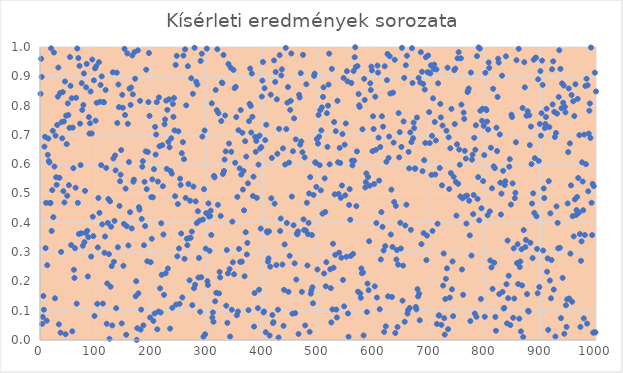
| Category | Series 0 |
|---|---|
| 1.0 | 0.84 |
| 2.0 | 0.96 |
| 3.0 | 0.898 |
| 4.0 | 0.055 |
| 5.0 | 0.079 |
| 6.0 | 0.15 |
| 7.0 | 0.103 |
| 8.0 | 0.66 |
| 9.0 | 0.693 |
| 10.0 | 0.314 |
| 11.0 | 0.468 |
| 12.0 | 0.066 |
| 13.0 | 0.255 |
| 14.0 | 0.632 |
| 15.0 | 0.688 |
| 16.0 | 0.611 |
| 17.0 | 0.606 |
| 18.0 | 0.468 |
| 19.0 | 0.468 |
| 20.0 | 0.995 |
| 21.0 | 0.372 |
| 22.0 | 0.511 |
| 23.0 | 0.714 |
| 24.0 | 0.419 |
| 25.0 | 0.981 |
| 26.0 | 0.592 |
| 27.0 | 0.142 |
| 28.0 | 0.697 |
| 29.0 | 0.555 |
| 30.0 | 0.53 |
| 31.0 | 0.734 |
| 32.0 | 0.83 |
| 33.0 | 0.93 |
| 34.0 | 0.054 |
| 35.0 | 0.554 |
| 36.0 | 0.842 |
| 37.0 | 0.025 |
| 38.0 | 0.301 |
| 39.0 | 0.744 |
| 40.0 | 0.688 |
| 41.0 | 0.846 |
| 42.0 | 0.508 |
| 43.0 | 0.746 |
| 44.0 | 0.469 |
| 45.0 | 0.882 |
| 46.0 | 0.02 |
| 47.0 | 0.766 |
| 48.0 | 0.669 |
| 49.0 | 0.492 |
| 50.0 | 0.807 |
| 51.0 | 0.768 |
| 52.0 | 0.528 |
| 53.0 | 0.724 |
| 54.0 | 0.966 |
| 55.0 | 0.867 |
| 56.0 | 0.324 |
| 57.0 | 0.825 |
| 58.0 | 0.03 |
| 59.0 | 0.725 |
| 60.0 | 0.586 |
| 61.0 | 0.24 |
| 62.0 | 0.212 |
| 63.0 | 0.313 |
| 64.0 | 0.52 |
| 65.0 | 0.827 |
| 66.0 | 0.124 |
| 67.0 | 0.995 |
| 68.0 | 0.468 |
| 69.0 | 0.962 |
| 70.0 | 0.362 |
| 71.0 | 0.936 |
| 72.0 | 0.738 |
| 73.0 | 0.597 |
| 74.0 | 0.364 |
| 75.0 | 0.877 |
| 76.0 | 0.785 |
| 77.0 | 0.322 |
| 78.0 | 0.802 |
| 79.0 | 0.91 |
| 80.0 | 0.334 |
| 81.0 | 0.509 |
| 82.0 | 0.366 |
| 83.0 | 0.862 |
| 84.0 | 0.942 |
| 85.0 | 0.373 |
| 86.0 | 0.217 |
| 87.0 | 0.351 |
| 88.0 | 0.761 |
| 89.0 | 0.705 |
| 90.0 | 0.74 |
| 91.0 | 0.848 |
| 92.0 | 0.285 |
| 93.0 | 0.705 |
| 94.0 | 0.957 |
| 95.0 | 0.421 |
| 96.0 | 0.354 |
| 97.0 | 0.886 |
| 98.0 | 0.082 |
| 99.0 | 0.927 |
| 100.0 | 0.749 |
| 101.0 | 0.934 |
| 102.0 | 0.81 |
| 103.0 | 0.123 |
| 104.0 | 0.316 |
| 105.0 | 0.485 |
| 106.0 | 0.948 |
| 107.0 | 0.434 |
| 108.0 | 0.813 |
| 109.0 | 0.87 |
| 110.0 | 0.597 |
| 111.0 | 0.9 |
| 112.0 | 0.395 |
| 113.0 | 0.124 |
| 114.0 | 0.812 |
| 115.0 | 0.811 |
| 116.0 | 0.298 |
| 117.0 | 0.353 |
| 118.0 | 0.853 |
| 119.0 | 0.587 |
| 120.0 | 0.055 |
| 121.0 | 0.193 |
| 122.0 | 0.4 |
| 123.0 | 0.481 |
| 124.0 | 0.293 |
| 125.0 | 0.004 |
| 126.0 | 0.473 |
| 127.0 | 0.182 |
| 128.0 | 0.387 |
| 129.0 | 0.252 |
| 130.0 | 0.05 |
| 131.0 | 0.914 |
| 132.0 | 0.62 |
| 133.0 | 0.267 |
| 134.0 | 0.407 |
| 135.0 | 0.63 |
| 136.0 | 0.579 |
| 137.0 | 0.109 |
| 138.0 | 0.912 |
| 139.0 | 0.741 |
| 140.0 | 0.317 |
| 141.0 | 0.872 |
| 142.0 | 0.795 |
| 143.0 | 0.458 |
| 144.0 | 0.542 |
| 145.0 | 0.564 |
| 146.0 | 0.648 |
| 147.0 | 0.057 |
| 148.0 | 0.837 |
| 149.0 | 0.793 |
| 150.0 | 0.253 |
| 151.0 | 0.396 |
| 152.0 | 0.994 |
| 153.0 | 0.768 |
| 154.0 | 0.517 |
| 155.0 | 0.018 |
| 156.0 | 0.388 |
| 157.0 | 0.978 |
| 158.0 | 0.738 |
| 159.0 | 0.323 |
| 160.0 | 0.607 |
| 161.0 | 0.858 |
| 162.0 | 0.436 |
| 163.0 | 0.802 |
| 164.0 | 0.862 |
| 165.0 | 0.381 |
| 166.0 | 0.971 |
| 167.0 | 0.839 |
| 168.0 | 0.54 |
| 169.0 | 0.547 |
| 170.0 | 0.983 |
| 171.0 | 0.892 |
| 172.0 | 0.149 |
| 173.0 | 0.201 |
| 174.0 | 0 |
| 175.0 | 0.04 |
| 176.0 | 0.989 |
| 177.0 | 0.159 |
| 178.0 | 0.453 |
| 179.0 | 0.445 |
| 180.0 | 0.816 |
| 181.0 | 0.035 |
| 182.0 | 0.104 |
| 183.0 | 0.413 |
| 184.0 | 0.591 |
| 185.0 | 0.61 |
| 186.0 | 0.05 |
| 187.0 | 0.323 |
| 188.0 | 0.54 |
| 189.0 | 0.389 |
| 190.0 | 0.644 |
| 191.0 | 0.923 |
| 192.0 | 0.515 |
| 193.0 | 0.269 |
| 194.0 | 0.642 |
| 195.0 | 0.812 |
| 196.0 | 0.979 |
| 197.0 | 0.765 |
| 198.0 | 0.077 |
| 199.0 | 0.265 |
| 200.0 | 0.488 |
| 201.0 | 0.346 |
| 202.0 | 0.548 |
| 203.0 | 0.487 |
| 204.0 | 0.065 |
| 205.0 | 0.583 |
| 206.0 | 0.09 |
| 207.0 | 0.727 |
| 208.0 | 0.633 |
| 209.0 | 0.701 |
| 210.0 | 0.812 |
| 211.0 | 0.036 |
| 212.0 | 0.541 |
| 213.0 | 0.097 |
| 214.0 | 0.828 |
| 215.0 | 0.661 |
| 216.0 | 0.176 |
| 217.0 | 0.094 |
| 218.0 | 0.398 |
| 219.0 | 0.222 |
| 220.0 | 0.665 |
| 221.0 | 0.525 |
| 222.0 | 0.36 |
| 223.0 | 0.154 |
| 224.0 | 0.736 |
| 225.0 | 0.753 |
| 226.0 | 0.227 |
| 227.0 | 0.817 |
| 228.0 | 0.584 |
| 229.0 | 0.785 |
| 230.0 | 0.244 |
| 231.0 | 0.676 |
| 232.0 | 0.821 |
| 233.0 | 0.658 |
| 234.0 | 0.039 |
| 235.0 | 0.577 |
| 236.0 | 0.689 |
| 237.0 | 0.568 |
| 238.0 | 0.11 |
| 239.0 | 0.806 |
| 240.0 | 0.761 |
| 241.0 | 0.826 |
| 242.0 | 0.715 |
| 243.0 | 0.491 |
| 244.0 | 0.939 |
| 245.0 | 0.121 |
| 246.0 | 0.97 |
| 247.0 | 0.286 |
| 248.0 | 0.464 |
| 249.0 | 0.712 |
| 250.0 | 0.312 |
| 251.0 | 0.123 |
| 252.0 | 0.551 |
| 253.0 | 0.529 |
| 254.0 | 0.363 |
| 255.0 | 0.638 |
| 256.0 | 0.145 |
| 257.0 | 0.675 |
| 258.0 | 0.971 |
| 259.0 | 0.617 |
| 260.0 | 0.277 |
| 261.0 | 0.992 |
| 262.0 | 0.485 |
| 263.0 | 0.801 |
| 264.0 | 0.346 |
| 265.0 | 0.324 |
| 266.0 | 0.935 |
| 267.0 | 0.533 |
| 268.0 | 0.347 |
| 269.0 | 0.204 |
| 270.0 | 0.475 |
| 271.0 | 0.349 |
| 272.0 | 0.893 |
| 273.0 | 0.37 |
| 274.0 | 0.119 |
| 275.0 | 0.84 |
| 276.0 | 0.524 |
| 277.0 | 0.177 |
| 278.0 | 0.997 |
| 279.0 | 0.189 |
| 280.0 | 0.473 |
| 281.0 | 0.881 |
| 282.0 | 0.399 |
| 283.0 | 0.872 |
| 284.0 | 0.439 |
| 285.0 | 0.213 |
| 286.0 | 0.28 |
| 287.0 | 0.407 |
| 288.0 | 0.096 |
| 289.0 | 0.952 |
| 290.0 | 0.214 |
| 291.0 | 0.977 |
| 292.0 | 0.694 |
| 293.0 | 0.411 |
| 294.0 | 0.011 |
| 295.0 | 0.515 |
| 296.0 | 0.715 |
| 297.0 | 0.02 |
| 298.0 | 0.312 |
| 299.0 | 0.433 |
| 300.0 | 0.994 |
| 301.0 | 0.201 |
| 302.0 | 0.188 |
| 303.0 | 0.466 |
| 304.0 | 0.422 |
| 305.0 | 0.304 |
| 306.0 | 0.423 |
| 307.0 | 0.442 |
| 308.0 | 0.358 |
| 309.0 | 0.808 |
| 310.0 | 0.077 |
| 311.0 | 0.094 |
| 312.0 | 0.062 |
| 313.0 | 0.56 |
| 314.0 | 0.555 |
| 315.0 | 0.132 |
| 316.0 | 0.853 |
| 317.0 | 0.161 |
| 318.0 | 0.784 |
| 319.0 | 0.992 |
| 320.0 | 0.461 |
| 321.0 | 0.774 |
| 322.0 | 0.159 |
| 323.0 | 0.232 |
| 324.0 | 0.214 |
| 325.0 | 0.423 |
| 326.0 | 0.747 |
| 327.0 | 0.879 |
| 328.0 | 0.877 |
| 329.0 | 0.567 |
| 330.0 | 0.973 |
| 331.0 | 0.577 |
| 332.0 | 0.616 |
| 333.0 | 0.766 |
| 334.0 | 0.644 |
| 335.0 | 0.117 |
| 336.0 | 0.307 |
| 337.0 | 0.059 |
| 338.0 | 0.227 |
| 339.0 | 0.942 |
| 340.0 | 0.671 |
| 341.0 | 0.242 |
| 342.0 | 0.012 |
| 343.0 | 0.929 |
| 344.0 | 0.642 |
| 345.0 | 0.103 |
| 346.0 | 0.404 |
| 347.0 | 0.265 |
| 348.0 | 0.922 |
| 349.0 | 0.224 |
| 350.0 | 0.86 |
| 351.0 | 0.605 |
| 352.0 | 0.864 |
| 353.0 | 0.761 |
| 354.0 | 0.084 |
| 355.0 | 0.488 |
| 356.0 | 0.097 |
| 357.0 | 0.716 |
| 358.0 | 0.311 |
| 359.0 | 0.586 |
| 360.0 | 0.267 |
| 361.0 | 0.785 |
| 362.0 | 0.564 |
| 363.0 | 0.267 |
| 364.0 | 0.707 |
| 365.0 | 0.513 |
| 366.0 | 0.577 |
| 367.0 | 0.443 |
| 368.0 | 0.218 |
| 369.0 | 0.678 |
| 370.0 | 0.368 |
| 371.0 | 0.626 |
| 372.0 | 0.292 |
| 373.0 | 0.331 |
| 374.0 | 0.535 |
| 375.0 | 0.102 |
| 376.0 | 0.747 |
| 377.0 | 0.806 |
| 378.0 | 0.926 |
| 379.0 | 0.799 |
| 380.0 | 0.708 |
| 381.0 | 0.91 |
| 382.0 | 0.762 |
| 383.0 | 0.492 |
| 384.0 | 0.557 |
| 385.0 | 0.046 |
| 386.0 | 0.16 |
| 387.0 | 0.693 |
| 388.0 | 0.642 |
| 389.0 | 0.679 |
| 390.0 | 0.485 |
| 391.0 | 0.692 |
| 392.0 | 0.109 |
| 393.0 | 0.599 |
| 394.0 | 0.172 |
| 395.0 | 0.698 |
| 396.0 | 0.654 |
| 397.0 | 0.38 |
| 398.0 | 0.658 |
| 399.0 | 0.831 |
| 400.0 | 0.885 |
| 401.0 | 0.949 |
| 402.0 | 0.094 |
| 403.0 | 0.097 |
| 404.0 | 0.859 |
| 405.0 | 0.682 |
| 406.0 | 0.027 |
| 407.0 | 0.735 |
| 408.0 | 0.371 |
| 409.0 | 0.367 |
| 410.0 | 0.268 |
| 411.0 | 0.278 |
| 412.0 | 0.371 |
| 413.0 | 0.015 |
| 414.0 | 0.25 |
| 415.0 | 0.837 |
| 416.0 | 0.484 |
| 417.0 | 0.621 |
| 418.0 | 0.085 |
| 419.0 | 0.058 |
| 420.0 | 0.061 |
| 421.0 | 0.954 |
| 422.0 | 0.465 |
| 423.0 | 0.881 |
| 424.0 | 0.915 |
| 425.0 | 0.256 |
| 426.0 | 0.821 |
| 427.0 | 0.636 |
| 428.0 | 0.103 |
| 429.0 | 0.009 |
| 430.0 | 0.721 |
| 431.0 | 0.972 |
| 432.0 | 0.372 |
| 433.0 | 0.415 |
| 434.0 | 0.903 |
| 435.0 | 0.924 |
| 436.0 | 0.258 |
| 437.0 | 0.654 |
| 438.0 | 0.048 |
| 439.0 | 0.171 |
| 440.0 | 0.326 |
| 441.0 | 0.599 |
| 442.0 | 0.997 |
| 443.0 | 0.72 |
| 444.0 | 0.399 |
| 445.0 | 0.81 |
| 446.0 | 0.863 |
| 447.0 | 0.164 |
| 448.0 | 0.605 |
| 449.0 | 0.287 |
| 450.0 | 0.785 |
| 451.0 | 0.816 |
| 452.0 | 0.978 |
| 453.0 | 0.49 |
| 454.0 | 0.09 |
| 455.0 | 0.644 |
| 456.0 | 0.392 |
| 457.0 | 0.756 |
| 458.0 | 0.262 |
| 459.0 | 0.092 |
| 460.0 | 0.685 |
| 461.0 | 0.206 |
| 462.0 | 0.363 |
| 463.0 | 0.361 |
| 464.0 | 0.371 |
| 465.0 | 0.021 |
| 466.0 | 0.837 |
| 467.0 | 0.828 |
| 468.0 | 0.667 |
| 469.0 | 0.911 |
| 470.0 | 0.678 |
| 471.0 | 0.164 |
| 472.0 | 0.641 |
| 473.0 | 0.973 |
| 474.0 | 0.412 |
| 475.0 | 0.375 |
| 476.0 | 0.623 |
| 477.0 | 0.05 |
| 478.0 | 0.373 |
| 479.0 | 0.873 |
| 480.0 | 0.468 |
| 481.0 | 0.254 |
| 482.0 | 0.361 |
| 483.0 | 0.4 |
| 484.0 | 0.5 |
| 485.0 | 0.028 |
| 486.0 | 0.556 |
| 487.0 | 0.158 |
| 488.0 | 0.169 |
| 489.0 | 0.358 |
| 490.0 | 0.18 |
| 491.0 | 0.125 |
| 492.0 | 0.495 |
| 493.0 | 0.901 |
| 494.0 | 0.909 |
| 495.0 | 0.607 |
| 496.0 | 0.605 |
| 497.0 | 0.523 |
| 498.0 | 0.686 |
| 499.0 | 0.241 |
| 500.0 | 0.67 |
| 501.0 | 0.768 |
| 502.0 | 0.694 |
| 503.0 | 0.597 |
| 504.0 | 0.785 |
| 505.0 | 0.511 |
| 506.0 | 0.715 |
| 507.0 | 0.794 |
| 508.0 | 0.431 |
| 509.0 | 0.83 |
| 510.0 | 0.862 |
| 511.0 | 0.227 |
| 512.0 | 0.552 |
| 513.0 | 0.437 |
| 514.0 | 0.183 |
| 515.0 | 0.265 |
| 516.0 | 0.774 |
| 517.0 | 0.659 |
| 518.0 | 0.8 |
| 519.0 | 0.872 |
| 520.0 | 0.977 |
| 521.0 | 0.6 |
| 522.0 | 0.241 |
| 523.0 | 0.177 |
| 524.0 | 0.06 |
| 525.0 | 0.925 |
| 526.0 | 0.104 |
| 527.0 | 0.328 |
| 528.0 | 0.247 |
| 529.0 | 0.744 |
| 530.0 | 0.497 |
| 531.0 | 0.291 |
| 532.0 | 0.713 |
| 533.0 | 0.104 |
| 534.0 | 0.077 |
| 535.0 | 0.816 |
| 536.0 | 0.607 |
| 537.0 | 0.498 |
| 538.0 | 0.298 |
| 539.0 | 0.656 |
| 540.0 | 0.604 |
| 541.0 | 0.485 |
| 542.0 | 0.281 |
| 543.0 | 0.527 |
| 544.0 | 0.703 |
| 545.0 | 0.205 |
| 546.0 | 0.895 |
| 547.0 | 0.115 |
| 548.0 | 0.666 |
| 549.0 | 0.494 |
| 550.0 | 0.739 |
| 551.0 | 0.284 |
| 552.0 | 0.917 |
| 553.0 | 0.883 |
| 554.0 | 0.091 |
| 555.0 | 0.011 |
| 556.0 | 0.461 |
| 557.0 | 0.515 |
| 558.0 | 0.41 |
| 559.0 | 0.287 |
| 560.0 | 0.877 |
| 561.0 | 0.612 |
| 562.0 | 0.596 |
| 563.0 | 0.294 |
| 564.0 | 0.918 |
| 565.0 | 0.612 |
| 566.0 | 0.965 |
| 567.0 | 0.999 |
| 568.0 | 0.932 |
| 569.0 | 0.457 |
| 570.0 | 0.644 |
| 571.0 | 0.935 |
| 572.0 | 0.165 |
| 573.0 | 0.84 |
| 574.0 | 0.801 |
| 575.0 | 0.796 |
| 576.0 | 0.159 |
| 577.0 | 0.144 |
| 578.0 | 0.244 |
| 579.0 | 0.228 |
| 580.0 | 0.719 |
| 581.0 | 0.23 |
| 582.0 | 0.016 |
| 583.0 | 0.891 |
| 584.0 | 0.819 |
| 585.0 | 0.521 |
| 586.0 | 0.539 |
| 587.0 | 0.568 |
| 588.0 | 0.095 |
| 589.0 | 0.193 |
| 590.0 | 0.556 |
| 591.0 | 0.17 |
| 592.0 | 0.337 |
| 593.0 | 0.527 |
| 594.0 | 0.876 |
| 595.0 | 0.853 |
| 596.0 | 0.933 |
| 597.0 | 0.92 |
| 598.0 | 0.644 |
| 599.0 | 0.764 |
| 600.0 | 0.72 |
| 601.0 | 0.532 |
| 602.0 | 0.183 |
| 603.0 | 0.83 |
| 604.0 | 0.649 |
| 605.0 | 0.399 |
| 606.0 | 0.145 |
| 607.0 | 0.937 |
| 608.0 | 0.913 |
| 609.0 | 0.691 |
| 610.0 | 0.544 |
| 611.0 | 0.105 |
| 612.0 | 0.659 |
| 613.0 | 0.275 |
| 614.0 | 0.436 |
| 615.0 | 0.764 |
| 616.0 | 0.386 |
| 617.0 | 0.728 |
| 618.0 | 0.305 |
| 619.0 | 0.028 |
| 620.0 | 0.934 |
| 621.0 | 0.321 |
| 622.0 | 0.047 |
| 623.0 | 0.608 |
| 624.0 | 0.887 |
| 625.0 | 0.976 |
| 626.0 | 0.149 |
| 627.0 | 0.621 |
| 628.0 | 0.694 |
| 629.0 | 0.968 |
| 630.0 | 0.841 |
| 631.0 | 0.36 |
| 632.0 | 0.513 |
| 633.0 | 0.147 |
| 634.0 | 0.317 |
| 635.0 | 0.844 |
| 636.0 | 0.674 |
| 637.0 | 0.471 |
| 638.0 | 0.956 |
| 639.0 | 0.024 |
| 640.0 | 0.458 |
| 641.0 | 0.275 |
| 642.0 | 0.307 |
| 643.0 | 0.044 |
| 644.0 | 0.257 |
| 645.0 | 0.774 |
| 646.0 | 0.623 |
| 647.0 | 0.709 |
| 648.0 | 0.4 |
| 649.0 | 0.312 |
| 650.0 | 0.659 |
| 651.0 | 0.997 |
| 652.0 | 0.134 |
| 653.0 | 0.254 |
| 654.0 | 0.746 |
| 655.0 | 0.895 |
| 656.0 | 0.062 |
| 657.0 | 0.391 |
| 658.0 | 0.938 |
| 659.0 | 0.462 |
| 660.0 | 0.97 |
| 661.0 | 0.09 |
| 662.0 | 0.102 |
| 663.0 | 0.642 |
| 664.0 | 0.586 |
| 665.0 | 0.109 |
| 666.0 | 0.708 |
| 667.0 | 0.376 |
| 668.0 | 0.675 |
| 669.0 | 0.996 |
| 670.0 | 0.877 |
| 671.0 | 0.689 |
| 672.0 | 0.742 |
| 673.0 | 0.723 |
| 674.0 | 0.585 |
| 675.0 | 0.585 |
| 676.0 | 0.113 |
| 677.0 | 0.105 |
| 678.0 | 0.759 |
| 679.0 | 0.173 |
| 680.0 | 0.149 |
| 681.0 | 0.895 |
| 682.0 | 0.158 |
| 683.0 | 0.067 |
| 684.0 | 0.879 |
| 685.0 | 0.982 |
| 686.0 | 0.327 |
| 687.0 | 0.915 |
| 688.0 | 0.576 |
| 689.0 | 0.874 |
| 690.0 | 0.365 |
| 691.0 | 0.614 |
| 692.0 | 0.855 |
| 693.0 | 0.672 |
| 694.0 | 0.965 |
| 695.0 | 0.273 |
| 696.0 | 0.356 |
| 697.0 | 0.914 |
| 698.0 | 0.971 |
| 699.0 | 0.913 |
| 700.0 | 0.778 |
| 701.0 | 0.672 |
| 702.0 | 0.91 |
| 703.0 | 0.937 |
| 704.0 | 0.564 |
| 705.0 | 0.697 |
| 706.0 | 0.372 |
| 707.0 | 0.825 |
| 708.0 | 0.925 |
| 709.0 | 0.94 |
| 710.0 | 0.744 |
| 711.0 | 0.565 |
| 712.0 | 0.681 |
| 713.0 | 0.924 |
| 714.0 | 0.055 |
| 715.0 | 0.397 |
| 716.0 | 0.876 |
| 717.0 | 0.084 |
| 718.0 | 0.084 |
| 719.0 | 0.587 |
| 720.0 | 0.806 |
| 721.0 | 0.76 |
| 722.0 | 0.052 |
| 723.0 | 0.528 |
| 724.0 | 0.732 |
| 725.0 | 0.186 |
| 726.0 | 0.295 |
| 727.0 | 0.075 |
| 728.0 | 0.019 |
| 729.0 | 0.14 |
| 730.0 | 0.209 |
| 731.0 | 0.714 |
| 732.0 | 0.245 |
| 733.0 | 0.929 |
| 734.0 | 0.037 |
| 735.0 | 0.692 |
| 736.0 | 0.515 |
| 737.0 | 0.145 |
| 738.0 | 0.655 |
| 739.0 | 0.57 |
| 740.0 | 0.789 |
| 741.0 | 0.173 |
| 742.0 | 0.268 |
| 743.0 | 0.081 |
| 744.0 | 0.557 |
| 745.0 | 0.921 |
| 746.0 | 0.737 |
| 747.0 | 0.926 |
| 748.0 | 0.539 |
| 749.0 | 0.424 |
| 750.0 | 0.668 |
| 751.0 | 0.961 |
| 752.0 | 0.533 |
| 753.0 | 0.982 |
| 754.0 | 0.65 |
| 755.0 | 0.598 |
| 756.0 | 0.49 |
| 757.0 | 0.961 |
| 758.0 | 0.803 |
| 759.0 | 0.241 |
| 760.0 | 0.484 |
| 761.0 | 0.154 |
| 762.0 | 0.776 |
| 763.0 | 0.755 |
| 764.0 | 0.646 |
| 765.0 | 0.49 |
| 766.0 | 0.619 |
| 767.0 | 0.397 |
| 768.0 | 0.493 |
| 769.0 | 0.846 |
| 770.0 | 0.851 |
| 771.0 | 0.858 |
| 772.0 | 0.475 |
| 773.0 | 0.357 |
| 774.0 | 0.065 |
| 775.0 | 0.913 |
| 776.0 | 0.288 |
| 777.0 | 0.615 |
| 778.0 | 0.632 |
| 779.0 | 0.43 |
| 780.0 | 0.495 |
| 781.0 | 0.69 |
| 782.0 | 0.09 |
| 783.0 | 0.65 |
| 784.0 | 0.733 |
| 785.0 | 0.079 |
| 786.0 | 0.969 |
| 787.0 | 0.482 |
| 788.0 | 0.556 |
| 789.0 | 0.998 |
| 790.0 | 0.408 |
| 791.0 | 0.994 |
| 792.0 | 0.783 |
| 793.0 | 0.14 |
| 794.0 | 0.45 |
| 795.0 | 0.748 |
| 796.0 | 0.789 |
| 797.0 | 0.542 |
| 798.0 | 0.731 |
| 799.0 | 0.631 |
| 800.0 | 0.079 |
| 801.0 | 0.912 |
| 802.0 | 0.788 |
| 803.0 | 0.784 |
| 804.0 | 0.745 |
| 805.0 | 0.426 |
| 806.0 | 0.718 |
| 807.0 | 0.947 |
| 808.0 | 0.929 |
| 809.0 | 0.439 |
| 810.0 | 0.271 |
| 811.0 | 0.656 |
| 812.0 | 0.248 |
| 813.0 | 0.518 |
| 814.0 | 0.175 |
| 815.0 | 0.857 |
| 816.0 | 0.593 |
| 817.0 | 0.264 |
| 818.0 | 0.587 |
| 819.0 | 0.079 |
| 820.0 | 0.032 |
| 821.0 | 0.725 |
| 822.0 | 0.645 |
| 823.0 | 0.83 |
| 824.0 | 0.96 |
| 825.0 | 0.947 |
| 826.0 | 0.157 |
| 827.0 | 0.702 |
| 828.0 | 0.537 |
| 829.0 | 0.428 |
| 830.0 | 0.499 |
| 831.0 | 0.902 |
| 832.0 | 0.164 |
| 833.0 | 0.577 |
| 834.0 | 0.107 |
| 835.0 | 0.11 |
| 836.0 | 0.529 |
| 837.0 | 0.542 |
| 838.0 | 0.968 |
| 839.0 | 0.19 |
| 840.0 | 0.057 |
| 841.0 | 0.339 |
| 842.0 | 0.143 |
| 843.0 | 0.219 |
| 844.0 | 0.592 |
| 845.0 | 0.617 |
| 846.0 | 0.051 |
| 847.0 | 0.462 |
| 848.0 | 0.769 |
| 849.0 | 0.761 |
| 850.0 | 0.534 |
| 851.0 | 0.076 |
| 852.0 | 0.313 |
| 853.0 | 0.142 |
| 854.0 | 0.484 |
| 855.0 | 0.502 |
| 856.0 | 0.675 |
| 857.0 | 0.955 |
| 858.0 | 0.262 |
| 859.0 | 0.327 |
| 860.0 | 0.191 |
| 861.0 | 0.994 |
| 862.0 | 0.073 |
| 863.0 | 0.249 |
| 864.0 | 0.268 |
| 865.0 | 0.029 |
| 866.0 | 0.31 |
| 867.0 | 0.186 |
| 868.0 | 0.792 |
| 869.0 | 0.01 |
| 870.0 | 0.375 |
| 871.0 | 0.948 |
| 872.0 | 0.862 |
| 873.0 | 0.318 |
| 874.0 | 0.341 |
| 875.0 | 0.765 |
| 876.0 | 0.157 |
| 877.0 | 0.781 |
| 878.0 | 0.1 |
| 879.0 | 0.097 |
| 880.0 | 0.767 |
| 881.0 | 0.665 |
| 882.0 | 0.332 |
| 883.0 | 0.729 |
| 884.0 | 0.6 |
| 885.0 | 0.466 |
| 886.0 | 0.28 |
| 887.0 | 0.501 |
| 888.0 | 0.956 |
| 889.0 | 0.434 |
| 890.0 | 0.621 |
| 891.0 | 0.963 |
| 892.0 | 0.964 |
| 893.0 | 0.422 |
| 894.0 | 0.311 |
| 895.0 | 0.16 |
| 896.0 | 0.89 |
| 897.0 | 0.611 |
| 898.0 | 0.181 |
| 899.0 | 0.737 |
| 900.0 | 0.918 |
| 901.0 | 0.697 |
| 902.0 | 0.774 |
| 903.0 | 0.953 |
| 904.0 | 0.871 |
| 905.0 | 0.305 |
| 906.0 | 0.517 |
| 907.0 | 0.484 |
| 908.0 | 0.723 |
| 909.0 | 0.737 |
| 910.0 | 0.761 |
| 911.0 | 0.789 |
| 912.0 | 0.233 |
| 913.0 | 0.279 |
| 914.0 | 0.035 |
| 915.0 | 0.542 |
| 916.0 | 0.727 |
| 917.0 | 0.203 |
| 918.0 | 0.432 |
| 919.0 | 0.142 |
| 920.0 | 0.273 |
| 921.0 | 0.924 |
| 922.0 | 0.804 |
| 923.0 | 0.951 |
| 924.0 | 0.172 |
| 925.0 | 0.779 |
| 926.0 | 0.693 |
| 927.0 | 0.012 |
| 928.0 | 0.707 |
| 929.0 | 0.456 |
| 930.0 | 0.773 |
| 931.0 | 0.4 |
| 932.0 | 0.313 |
| 933.0 | 0.829 |
| 934.0 | 0.989 |
| 935.0 | 0.315 |
| 936.0 | 0.925 |
| 937.0 | 0.075 |
| 938.0 | 0.791 |
| 939.0 | 0.876 |
| 940.0 | 0.212 |
| 941.0 | 0.81 |
| 942.0 | 0.868 |
| 943.0 | 0.021 |
| 944.0 | 0.796 |
| 945.0 | 0.777 |
| 946.0 | 0.118 |
| 947.0 | 0.045 |
| 948.0 | 0.139 |
| 949.0 | 0.466 |
| 950.0 | 0.641 |
| 951.0 | 0.858 |
| 952.0 | 0.141 |
| 953.0 | 0.671 |
| 954.0 | 0.295 |
| 955.0 | 0.528 |
| 956.0 | 0.836 |
| 957.0 | 0.13 |
| 958.0 | 0.423 |
| 959.0 | 0.815 |
| 960.0 | 0.354 |
| 961.0 | 0.764 |
| 962.0 | 0.48 |
| 963.0 | 0.873 |
| 964.0 | 0.426 |
| 965.0 | 0.443 |
| 966.0 | 0.488 |
| 967.0 | 0.823 |
| 968.0 | 0.553 |
| 969.0 | 0.434 |
| 970.0 | 0.699 |
| 971.0 | 0.362 |
| 972.0 | 0.045 |
| 973.0 | 0.27 |
| 974.0 | 0.337 |
| 975.0 | 0.606 |
| 976.0 | 0.541 |
| 977.0 | 0.443 |
| 978.0 | 0.074 |
| 979.0 | 0.701 |
| 980.0 | 0.358 |
| 981.0 | 0.867 |
| 982.0 | 0.6 |
| 983.0 | 0.892 |
| 984.0 | 0.056 |
| 985.0 | 0.869 |
| 986.0 | 0.508 |
| 987.0 | 0.705 |
| 988.0 | 0.783 |
| 989.0 | 0.807 |
| 990.0 | 0.69 |
| 991.0 | 0.998 |
| 992.0 | 0.468 |
| 993.0 | 0.358 |
| 994.0 | 0.533 |
| 995.0 | 0.025 |
| 996.0 | 0.525 |
| 997.0 | 0.027 |
| 998.0 | 0.912 |
| 999.0 | 0.026 |
| 1000.0 | 0.848 |